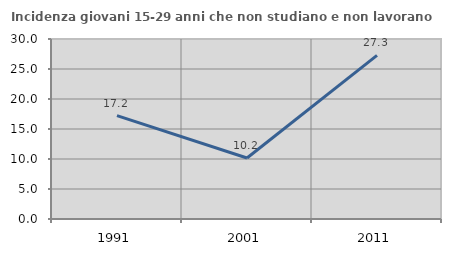
| Category | Incidenza giovani 15-29 anni che non studiano e non lavorano  |
|---|---|
| 1991.0 | 17.241 |
| 2001.0 | 10.169 |
| 2011.0 | 27.273 |